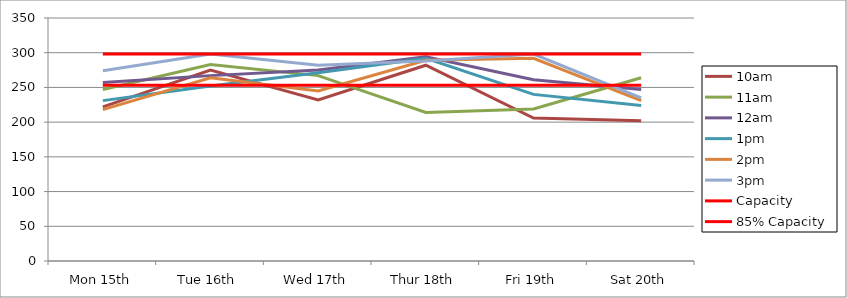
| Category | 9am | 10am | 11am | 12am | 1pm | 2pm | 3pm | 4pm | 5pm | Capacity | 85% Capacity |
|---|---|---|---|---|---|---|---|---|---|---|---|
| Mon 15th |  | 222 | 247 | 257 | 231 | 218 | 274 |  |  | 298 | 253 |
| Tue 16th |  | 275 | 283 | 267 | 252 | 264 | 298 |  |  | 298 | 253 |
| Wed 17th |  | 232 | 267 | 275 | 271 | 245 | 282 |  |  | 298 | 253 |
| Thur 18th |  | 282 | 214 | 294 | 292 | 289 | 288 |  |  | 298 | 253 |
| Fri 19th |  | 206 | 219 | 261 | 240 | 292 | 298 |  |  | 298 | 253 |
| Sat 20th |  | 202 | 264 | 247 | 224 | 231 | 235 |  |  | 298 | 253 |